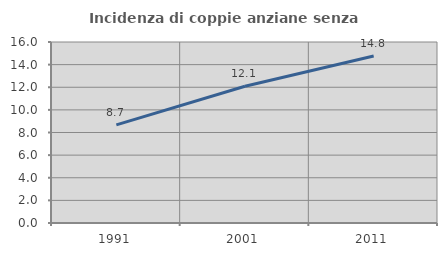
| Category | Incidenza di coppie anziane senza figli  |
|---|---|
| 1991.0 | 8.675 |
| 2001.0 | 12.09 |
| 2011.0 | 14.756 |